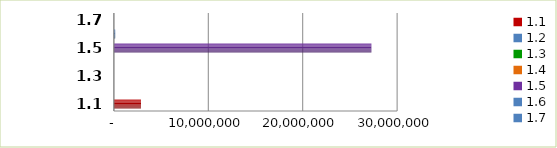
| Category | Series 0 |
|---|---|
| 1.1 | 2869247 |
| 1.2 | 0 |
| 1.3 | 0 |
| 1.4 | 0 |
| 1.5 | 27275754 |
| 1.6 | 142961 |
| 1.7 | 0 |